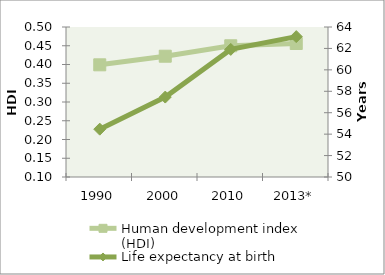
| Category | Human development index (HDI) |
|---|---|
| 1990 | 0.399 |
| 2000 | 0.422 |
| 2010 | 0.45 |
| 2013* | 0.456 |